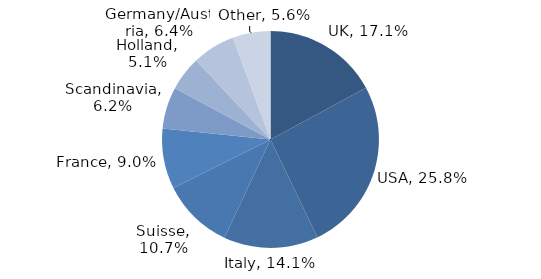
| Category | Investment Style |
|---|---|
| UK | 0.171 |
| USA | 0.258 |
| Italy | 0.141 |
| Suisse | 0.107 |
| France | 0.09 |
| Scandinavia | 0.062 |
| Holland | 0.051 |
| Germany/Austria | 0.064 |
| Other | 0.056 |